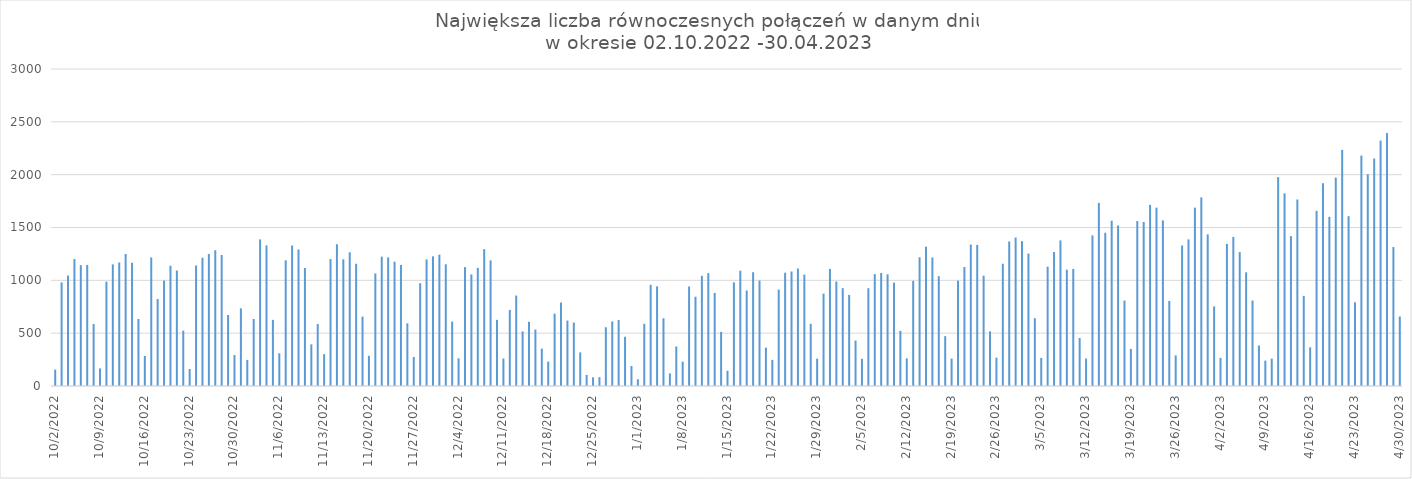
| Category | Max liczba połączeń |
|---|---|
| 10/2/22 | 155 |
| 10/3/22 | 980 |
| 10/4/22 | 1045 |
| 10/5/22 | 1201 |
| 10/6/22 | 1144 |
| 10/7/22 | 1146 |
| 10/8/22 | 586 |
| 10/9/22 | 166 |
| 10/10/22 | 988 |
| 10/11/22 | 1151 |
| 10/12/22 | 1169 |
| 10/13/22 | 1249 |
| 10/14/22 | 1166 |
| 10/15/22 | 634 |
| 10/16/22 | 284 |
| 10/17/22 | 1217 |
| 10/18/22 | 824 |
| 10/19/22 | 998 |
| 10/20/22 | 1138 |
| 10/21/22 | 1093 |
| 10/22/22 | 523 |
| 10/23/22 | 161 |
| 10/24/22 | 1141 |
| 10/25/22 | 1214 |
| 10/26/22 | 1249 |
| 10/27/22 | 1285 |
| 10/28/22 | 1240 |
| 10/29/22 | 672 |
| 10/30/22 | 293 |
| 10/31/22 | 735 |
| 11/1/22 | 247 |
| 11/2/22 | 634 |
| 11/3/22 | 1387 |
| 11/4/22 | 1331 |
| 11/5/22 | 626 |
| 11/6/22 | 309 |
| 11/7/22 | 1189 |
| 11/8/22 | 1330 |
| 11/9/22 | 1292 |
| 11/10/22 | 1117 |
| 11/11/22 | 394 |
| 11/12/22 | 586 |
| 11/13/22 | 301 |
| 11/14/22 | 1201 |
| 11/15/22 | 1342 |
| 11/16/22 | 1199 |
| 11/17/22 | 1266 |
| 11/18/22 | 1157 |
| 11/19/22 | 657 |
| 11/20/22 | 286 |
| 11/21/22 | 1065 |
| 11/22/22 | 1224 |
| 11/23/22 | 1217 |
| 11/24/22 | 1176 |
| 11/25/22 | 1145 |
| 11/26/22 | 593 |
| 11/27/22 | 275 |
| 11/28/22 | 973 |
| 11/29/22 | 1198 |
| 11/30/22 | 1227 |
| 12/1/22 | 1243 |
| 12/2/22 | 1152 |
| 12/3/22 | 610 |
| 12/4/22 | 262 |
| 12/5/22 | 1125 |
| 12/6/22 | 1056 |
| 12/7/22 | 1118 |
| 12/8/22 | 1295 |
| 12/9/22 | 1189 |
| 12/10/22 | 626 |
| 12/11/22 | 260 |
| 12/12/22 | 720 |
| 12/13/22 | 856 |
| 12/14/22 | 516 |
| 12/15/22 | 608 |
| 12/16/22 | 535 |
| 12/17/22 | 354 |
| 12/18/22 | 231 |
| 12/19/22 | 685 |
| 12/20/22 | 790 |
| 12/21/22 | 619 |
| 12/22/22 | 600 |
| 12/23/22 | 318 |
| 12/24/22 | 105 |
| 12/25/22 | 82 |
| 12/26/22 | 84 |
| 12/27/22 | 556 |
| 12/28/22 | 611 |
| 12/29/22 | 624 |
| 12/30/22 | 466 |
| 12/31/22 | 189 |
| 1/1/23 | 64 |
| 1/2/23 | 589 |
| 1/3/23 | 958 |
| 1/4/23 | 943 |
| 1/5/23 | 641 |
| 1/6/23 | 119 |
| 1/7/23 | 374 |
| 1/8/23 | 230 |
| 1/9/23 | 942 |
| 1/10/23 | 845 |
| 1/11/23 | 1043 |
| 1/12/23 | 1068 |
| 1/13/23 | 881 |
| 1/14/23 | 512 |
| 1/15/23 | 144 |
| 1/16/23 | 981 |
| 1/17/23 | 1091 |
| 1/18/23 | 904 |
| 1/19/23 | 1077 |
| 1/20/23 | 998 |
| 1/21/23 | 363 |
| 1/22/23 | 247 |
| 1/23/23 | 913 |
| 1/24/23 | 1072 |
| 1/25/23 | 1084 |
| 1/26/23 | 1112 |
| 1/27/23 | 1054 |
| 1/28/23 | 589 |
| 1/29/23 | 259 |
| 1/30/23 | 874 |
| 1/31/23 | 1108 |
| 2/1/23 | 989 |
| 2/2/23 | 926 |
| 2/3/23 | 862 |
| 2/4/23 | 430 |
| 2/5/23 | 257 |
| 2/6/23 | 925 |
| 2/7/23 | 1059 |
| 2/8/23 | 1070 |
| 2/9/23 | 1057 |
| 2/10/23 | 978 |
| 2/11/23 | 522 |
| 2/12/23 | 262 |
| 2/13/23 | 995 |
| 2/14/23 | 1218 |
| 2/15/23 | 1319 |
| 2/16/23 | 1216 |
| 2/17/23 | 1039 |
| 2/18/23 | 472 |
| 2/19/23 | 259 |
| 2/20/23 | 997 |
| 2/21/23 | 1126 |
| 2/22/23 | 1339 |
| 2/23/23 | 1335 |
| 2/24/23 | 1044 |
| 2/25/23 | 517 |
| 2/26/23 | 268 |
| 2/27/23 | 1157 |
| 2/28/23 | 1368 |
| 3/1/23 | 1405 |
| 3/2/23 | 1371 |
| 3/3/23 | 1253 |
| 3/4/23 | 642 |
| 3/5/23 | 266 |
| 3/6/23 | 1129 |
| 3/7/23 | 1268 |
| 3/8/23 | 1378 |
| 3/9/23 | 1101 |
| 3/10/23 | 1108 |
| 3/11/23 | 454 |
| 3/12/23 | 260 |
| 3/13/23 | 1425 |
| 3/14/23 | 1733 |
| 3/15/23 | 1450 |
| 3/16/23 | 1564 |
| 3/17/23 | 1519 |
| 3/18/23 | 809 |
| 3/19/23 | 351 |
| 3/20/23 | 1561 |
| 3/21/23 | 1552 |
| 3/22/23 | 1714 |
| 3/23/23 | 1688 |
| 3/24/23 | 1567 |
| 3/25/23 | 805 |
| 3/26/23 | 290 |
| 3/27/23 | 1330 |
| 3/28/23 | 1387 |
| 3/29/23 | 1688 |
| 3/30/23 | 1785 |
| 3/31/23 | 1435 |
| 4/1/23 | 753 |
| 4/2/23 | 266 |
| 4/3/23 | 1345 |
| 4/4/23 | 1411 |
| 4/5/23 | 1267 |
| 4/6/23 | 1076 |
| 4/7/23 | 809 |
| 4/8/23 | 383 |
| 4/9/23 | 240 |
| 4/10/23 | 259 |
| 4/11/23 | 1977 |
| 4/12/23 | 1824 |
| 4/13/23 | 1418 |
| 4/14/23 | 1765 |
| 4/15/23 | 853 |
| 4/16/23 | 366 |
| 4/17/23 | 1657 |
| 4/18/23 | 1919 |
| 4/19/23 | 1601 |
| 4/20/23 | 1972 |
| 4/21/23 | 2235 |
| 4/22/23 | 1607 |
| 4/23/23 | 792 |
| 4/24/23 | 2181 |
| 4/25/23 | 2004 |
| 4/26/23 | 2153 |
| 4/27/23 | 2323 |
| 4/28/23 | 2394 |
| 4/29/23 | 1315 |
| 4/30/23 | 658 |